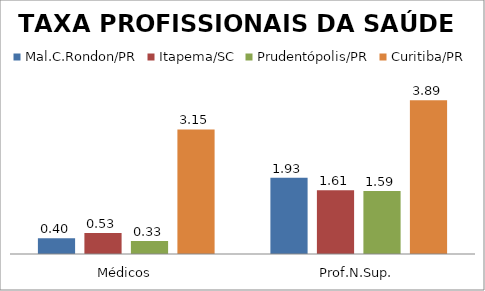
| Category | Mal.C.Rondon/PR | Itapema/SC | Prudentópolis/PR | Toledo/PR | Cascavel/PR | Curitiba/PR |
|---|---|---|---|---|---|---|
| Médicos | 0.4 | 0.53 | 0.33 |  |  | 3.15 |
| Prof.N.Sup. | 1.93 | 1.61 | 1.59 |  |  | 3.89 |